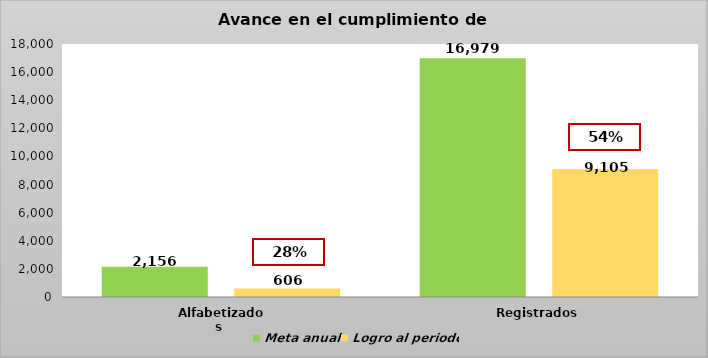
| Category | Meta anual | Logro al periodo |
|---|---|---|
| Alfabetizados  | 2156 | 606 |
| Registrados | 16979 | 9105 |